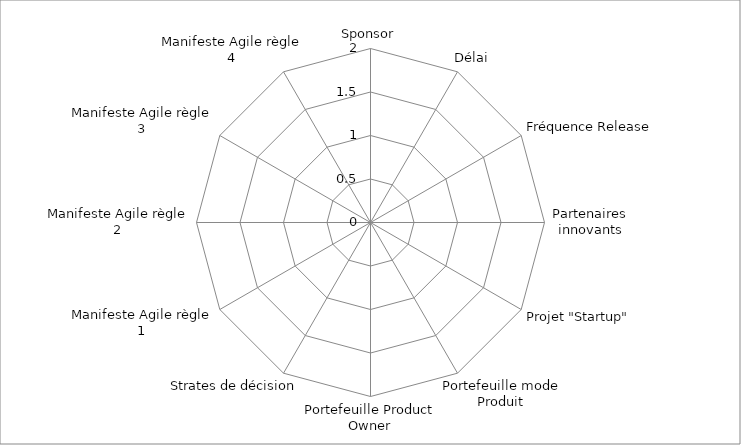
| Category | Series 0 |
|---|---|
| Sponsor | 0 |
| Délai | 0 |
| Fréquence Release | 0 |
| Partenaires innovants | 0 |
| Projet "Startup" | 0 |
| Portefeuille mode Produit | 0 |
| Portefeuille Product Owner | 0 |
| Strates de décision | 0 |
| Manifeste Agile règle 1 | 0 |
| Manifeste Agile règle 2 | 0 |
| Manifeste Agile règle 3 | 0 |
| Manifeste Agile règle 4 | 0 |